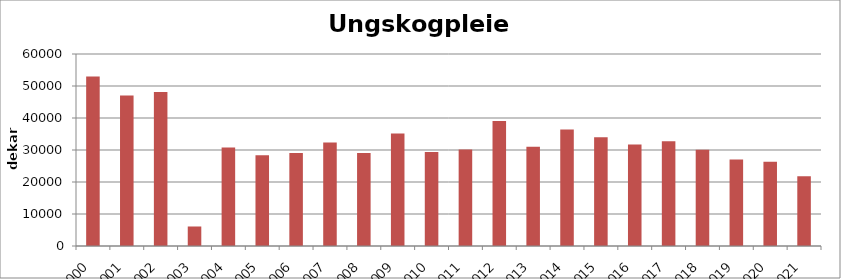
| Category | Totalt |
|---|---|
| 2000 | 53002 |
| 2001 | 47067 |
| 2002 | 48097 |
| 2003 | 6098 |
| 2004 | 30775 |
| 2005 | 28368 |
| 2006 | 29042 |
| 2007 | 32376 |
| 2008 | 29052 |
| 2009 | 35119 |
| 2010 | 29372 |
| 2011 | 30175 |
| 2012 | 39025 |
| 2013 | 31034 |
| 2014 | 36422 |
| 2015 | 33951 |
| 2016 | 31710 |
| 2017 | 32719 |
| 2018 | 30089 |
| 2019 | 27019 |
| 2020 | 26303 |
| 2021 | 21827 |